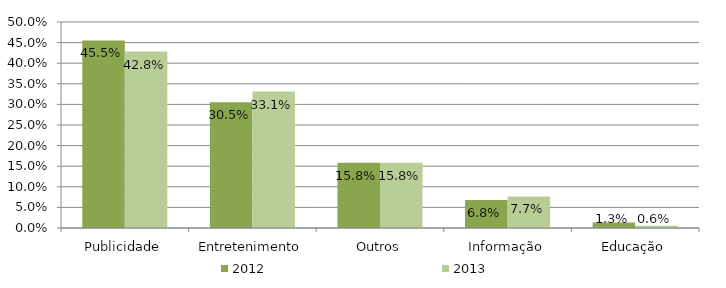
| Category | 2012 | 2013 |
|---|---|---|
| Publicidade | 0.455 | 0.428 |
| Entretenimento | 0.305 | 0.331 |
| Outros | 0.158 | 0.158 |
| Informação | 0.068 | 0.077 |
| Educação | 0.013 | 0.006 |